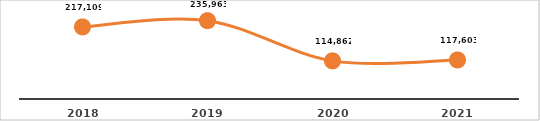
| Category | EVALUACIÓN DE COMPETENCIAS (%) |
|---|---|
| 2018.0 | 217109 |
| 2019.0 | 235963 |
| 2020.0 | 114862 |
| 2021.0 | 117603 |